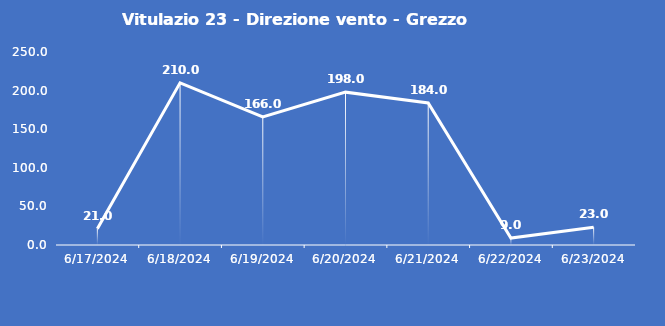
| Category | Vitulazio 23 - Direzione vento - Grezzo (°N) |
|---|---|
| 6/17/24 | 21 |
| 6/18/24 | 210 |
| 6/19/24 | 166 |
| 6/20/24 | 198 |
| 6/21/24 | 184 |
| 6/22/24 | 9 |
| 6/23/24 | 23 |